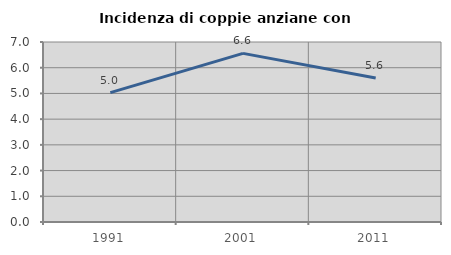
| Category | Incidenza di coppie anziane con figli |
|---|---|
| 1991.0 | 5.031 |
| 2001.0 | 6.557 |
| 2011.0 | 5.6 |